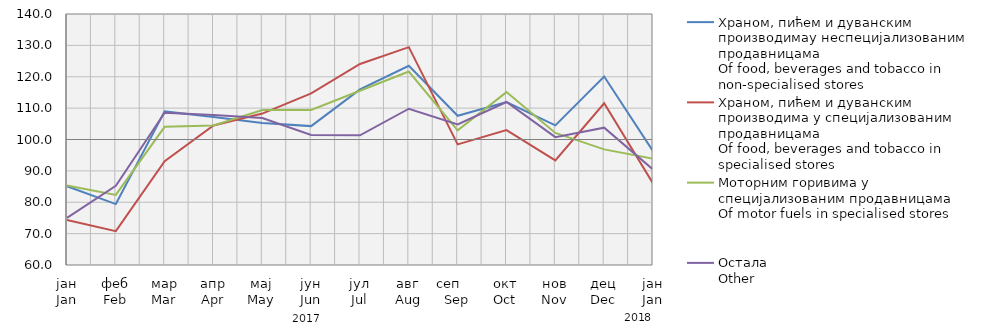
| Category | Храном, пићем и дуванским производимау неспецијализованим продавницама
Of food, beverages and tobacco in non-specialised stores
 | Храном, пићем и дуванским производима у специјализовaним продавницама
Of food, beverages and tobacco in specialised stores | Моторним горивима у специјализованим продавницама
Of motor fuels in specialised stores | Остала
Other |
|---|---|---|---|---|
| јан
Jan | 85.099 | 74.328 | 85.371 | 75.02 |
| феб
Feb | 79.418 | 70.792 | 82.332 | 85.25 |
| мар
Mar | 108.958 | 93.097 | 104.046 | 108.518 |
| апр
Apr | 107.187 | 104.456 | 104.458 | 107.78 |
| мај
May | 105.292 | 108.265 | 109.385 | 106.843 |
| јун
Jun | 104.266 | 114.686 | 109.425 | 101.464 |
| јул
Jul | 115.952 | 124.078 | 115.551 | 101.353 |
| авг
Aug | 123.494 | 129.435 | 121.673 | 109.807 |
| сеп     Sep | 107.568 | 98.457 | 102.908 | 104.789 |
| окт
Oct | 111.938 | 102.999 | 115.109 | 111.951 |
| нов
Nov | 104.514 | 93.335 | 102.083 | 100.762 |
| дец
Dec | 120.059 | 111.537 | 96.853 | 103.773 |
| јан
Jan | 96.298 | 85.996 | 93.873 | 90.431 |